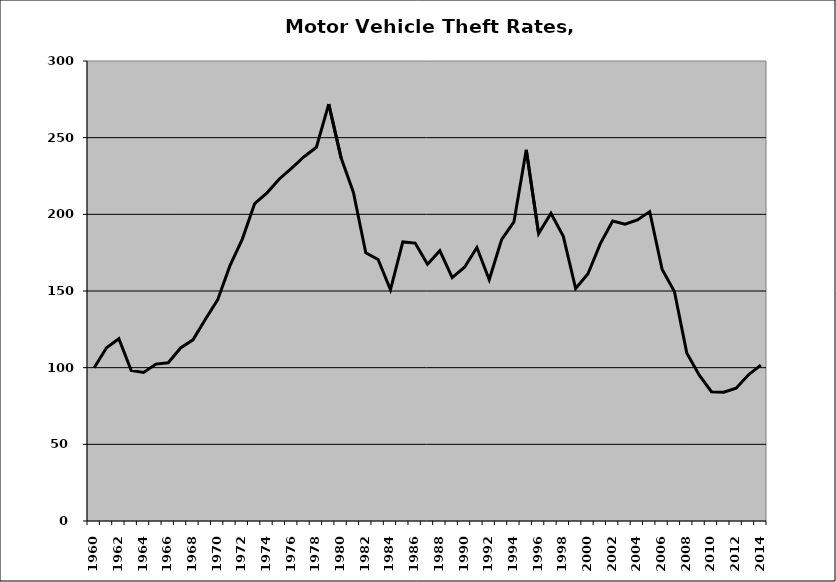
| Category | Motor Vehicle |
|---|---|
| 1960.0 | 99.971 |
| 1961.0 | 113.012 |
| 1962.0 | 118.911 |
| 1963.0 | 98.177 |
| 1964.0 | 96.821 |
| 1965.0 | 102.312 |
| 1966.0 | 103.17 |
| 1967.0 | 112.876 |
| 1968.0 | 118.156 |
| 1969.0 | 131.476 |
| 1970.0 | 144.178 |
| 1971.0 | 166.53 |
| 1972.0 | 183.862 |
| 1973.0 | 207.013 |
| 1974.0 | 214.018 |
| 1975.0 | 223.049 |
| 1976.0 | 230.205 |
| 1977.0 | 237.573 |
| 1978.0 | 243.736 |
| 1979.0 | 271.823 |
| 1980.0 | 236.852 |
| 1981.0 | 214.286 |
| 1982.0 | 174.922 |
| 1983.0 | 170.576 |
| 1984.0 | 150.749 |
| 1985.0 | 181.99 |
| 1986.0 | 181.256 |
| 1987.0 | 167.435 |
| 1988.0 | 176.276 |
| 1989.0 | 158.777 |
| 1990.0 | 165.483 |
| 1991.0 | 178.345 |
| 1992.0 | 157.357 |
| 1993.0 | 183.439 |
| 1994.0 | 195.057 |
| 1995.0 | 242.046 |
| 1996.0 | 187.468 |
| 1997.0 | 200.744 |
| 1998.0 | 185.679 |
| 1999.0 | 151.634 |
| 2000.0 | 161.211 |
| 2001.0 | 180.905 |
| 2002.0 | 195.589 |
| 2003.0 | 193.558 |
| 2004.0 | 196.324 |
| 2005.0 | 201.768 |
| 2006.0 | 164.273 |
| 2007.0 | 149.726 |
| 2008.0 | 109.656 |
| 2009.0 | 95.226 |
| 2010.0 | 84.334 |
| 2011.0 | 84.041 |
| 2012.0 | 86.614 |
| 2013.0 | 95.36 |
| 2014.0 | 101.624 |